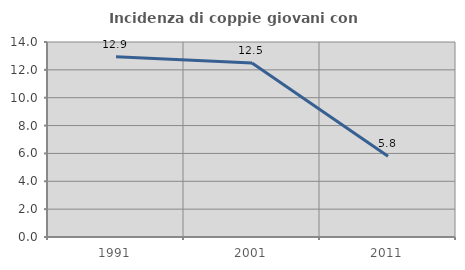
| Category | Incidenza di coppie giovani con figli |
|---|---|
| 1991.0 | 12.949 |
| 2001.0 | 12.5 |
| 2011.0 | 5.795 |